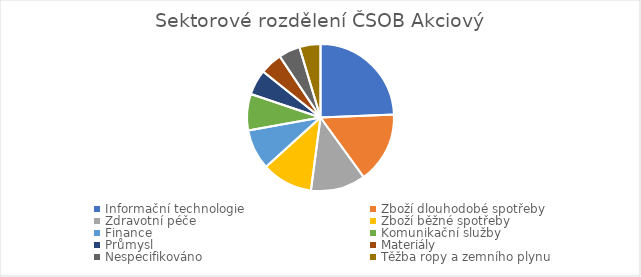
| Category | Series 0 |
|---|---|
| Informační technologie | 0.243 |
| Zboží dlouhodobé spotřeby | 0.156 |
| Zdravotní péče | 0.12 |
| Zboží běžné spotřeby | 0.112 |
| Finance | 0.089 |
| Komunikační služby | 0.08 |
| Průmysl | 0.056 |
| Materiály | 0.049 |
| Nespecifikováno | 0.047 |
| Těžba ropy a zemního plynu | 0.046 |